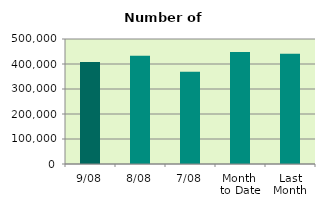
| Category | Series 0 |
|---|---|
| 9/08 | 408208 |
| 8/08 | 432534 |
| 7/08 | 369220 |
| Month 
to Date | 447542.857 |
| Last
Month | 440756.667 |